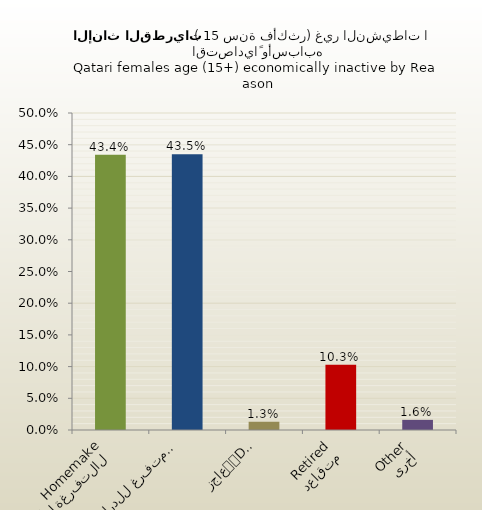
| Category | الاناث القطريات |
|---|---|
| التفرغة لأعمال المنزل
Homemaker | 0.434 |
| متفرغ للدراسة
Student | 0.435 |
| عاجز
Disabled | 0.013 |
| متقاعد
Retired | 0.103 |
| أخرى
Other | 0.016 |